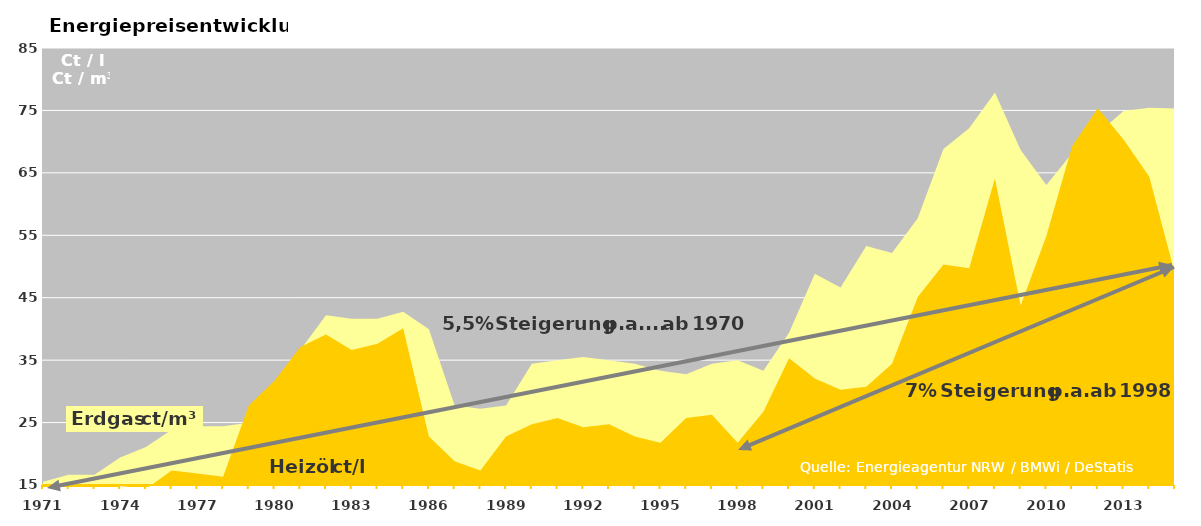
| Category | Erdgas m³ | Heizöl l |
|---|---|---|
| 1971.0 | 15.54 | 8.91 |
| 1972.0 | 16.65 | 7.92 |
| 1973.0 | 16.65 | 11.88 |
| 1974.0 | 19.425 | 14.85 |
| 1975.0 | 21.09 | 14.355 |
| 1976.0 | 23.865 | 17.325 |
| 1977.0 | 24.42 | 16.83 |
| 1978.0 | 24.42 | 16.335 |
| 1979.0 | 24.975 | 27.72 |
| 1980.0 | 28.86 | 31.68 |
| 1981.0 | 36.63 | 37.125 |
| 1982.0 | 42.18 | 39.105 |
| 1983.0 | 41.625 | 36.63 |
| 1984.0 | 41.625 | 37.62 |
| 1985.0 | 42.735 | 40.095 |
| 1986.0 | 39.96 | 22.77 |
| 1987.0 | 27.75 | 18.81 |
| 1988.0 | 27.195 | 17.325 |
| 1989.0 | 27.75 | 22.77 |
| 1990.0 | 34.41 | 24.75 |
| 1991.0 | 34.965 | 25.74 |
| 1992.0 | 35.52 | 24.255 |
| 1993.0 | 34.965 | 24.75 |
| 1994.0 | 34.41 | 22.77 |
| 1995.0 | 33.3 | 21.78 |
| 1996.0 | 32.745 | 25.74 |
| 1997.0 | 34.41 | 26.235 |
| 1998.0 | 34.965 | 21.78 |
| 1999.0 | 33.3 | 26.73 |
| 2000.0 | 39.405 | 35.3 |
| 2001.0 | 48.84 | 32.061 |
| 2002.0 | 46.62 | 30.271 |
| 2003.0 | 53.28 | 30.749 |
| 2004.0 | 52.17 | 34.407 |
| 2005.0 | 57.72 | 45.106 |
| 2006.0 | 68.82 | 50.323 |
| 2007.0 | 72.15 | 49.732 |
| 2008.0 | 77.866 | 64.082 |
| 2009.0 | 68.654 | 43.768 |
| 2010.0 | 63.048 | 54.872 |
| 2011.0 | 68.154 | 69.26 |
| 2012.0 | 71.318 | 75.33 |
| 2013.0 | 74.925 | 70.36 |
| 2014.0 | 75.424 | 64.37 |
| 2015.0 | 75.314 | 48.79 |